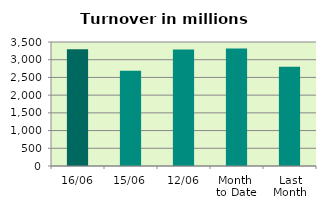
| Category | Series 0 |
|---|---|
| 16/06 | 3298.496 |
| 15/06 | 2686.876 |
| 12/06 | 3290.488 |
| Month 
to Date | 3315.769 |
| Last
Month | 2802.964 |